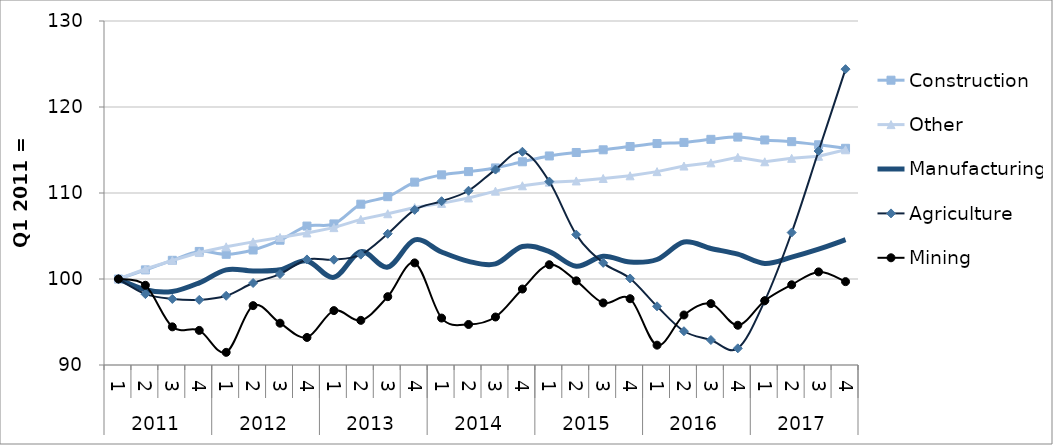
| Category | Construction | Other | Manufacturing | Agriculture | Mining |
|---|---|---|---|---|---|
| 0 | 100 | 100 | 100 | 100 | 100 |
| 1 | 101.06 | 101.162 | 98.753 | 98.24 | 99.268 |
| 2 | 102.172 | 102.155 | 98.552 | 97.682 | 94.437 |
| 3 | 103.206 | 103.076 | 99.553 | 97.57 | 94.023 |
| 4 | 102.872 | 103.743 | 101.063 | 98.048 | 91.473 |
| 5 | 103.373 | 104.315 | 100.94 | 99.534 | 96.902 |
| 6 | 104.51 | 104.825 | 101.071 | 100.575 | 94.863 |
| 7 | 106.155 | 105.355 | 102.103 | 102.276 | 93.203 |
| 8 | 106.405 | 105.975 | 100.195 | 102.243 | 96.326 |
| 9 | 108.699 | 106.929 | 103.177 | 102.829 | 95.191 |
| 10 | 109.572 | 107.587 | 101.392 | 105.261 | 97.946 |
| 11 | 111.263 | 108.305 | 104.542 | 108.038 | 101.871 |
| 12 | 112.109 | 108.795 | 103.137 | 109.045 | 95.458 |
| 13 | 112.489 | 109.423 | 102.056 | 110.262 | 94.712 |
| 14 | 112.915 | 110.216 | 101.75 | 112.724 | 95.58 |
| 15 | 113.63 | 110.839 | 103.785 | 114.796 | 98.833 |
| 16 | 114.308 | 111.262 | 103.185 | 111.329 | 101.661 |
| 17 | 114.71 | 111.401 | 101.487 | 105.163 | 99.787 |
| 18 | 115.023 | 111.69 | 102.639 | 101.877 | 97.22 |
| 19 | 115.407 | 111.999 | 101.968 | 100.061 | 97.707 |
| 20 | 115.751 | 112.484 | 102.271 | 96.823 | 92.309 |
| 21 | 115.881 | 113.134 | 104.295 | 93.927 | 95.814 |
| 22 | 116.24 | 113.506 | 103.547 | 92.906 | 97.133 |
| 23 | 116.502 | 114.147 | 102.887 | 91.939 | 94.622 |
| 24 | 116.165 | 113.631 | 101.803 | 97.453 | 97.477 |
| 25 | 115.969 | 114.033 | 102.542 | 105.403 | 99.328 |
| 26 | 115.607 | 114.273 | 103.468 | 114.878 | 100.828 |
| 27 | 115.197 | 115.028 | 104.566 | 124.401 | 99.693 |